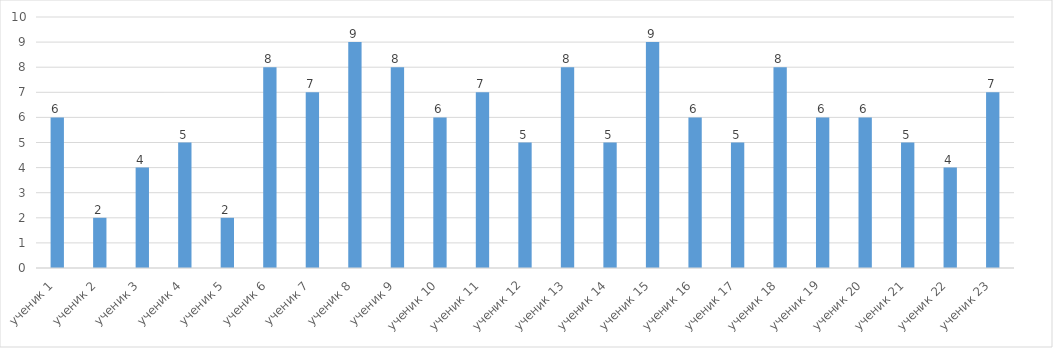
| Category | Series 0 |
|---|---|
| ученик 1 | 6 |
| ученик 2 | 2 |
| ученик 3 | 4 |
| ученик 4 | 5 |
| ученик 5 | 2 |
| ученик 6 | 8 |
| ученик 7 | 7 |
| ученик 8 | 9 |
| ученик 9 | 8 |
| ученик 10 | 6 |
| ученик 11 | 7 |
|  ученик 12 | 5 |
| ученик 13 | 8 |
| ученик 14 | 5 |
| ученик 15 | 9 |
| ученик 16 | 6 |
| ученик 17 | 5 |
| ученик 18 | 8 |
|  ученик 19 | 6 |
| ученик 20 | 6 |
| ученик 21 | 5 |
| ученик 22 | 4 |
| ученик 23 | 7 |